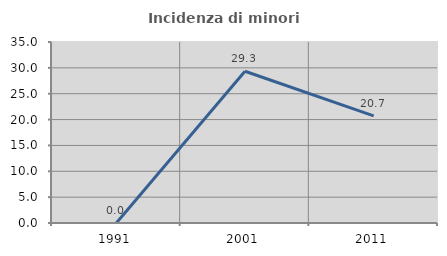
| Category | Incidenza di minori stranieri |
|---|---|
| 1991.0 | 0 |
| 2001.0 | 29.348 |
| 2011.0 | 20.707 |